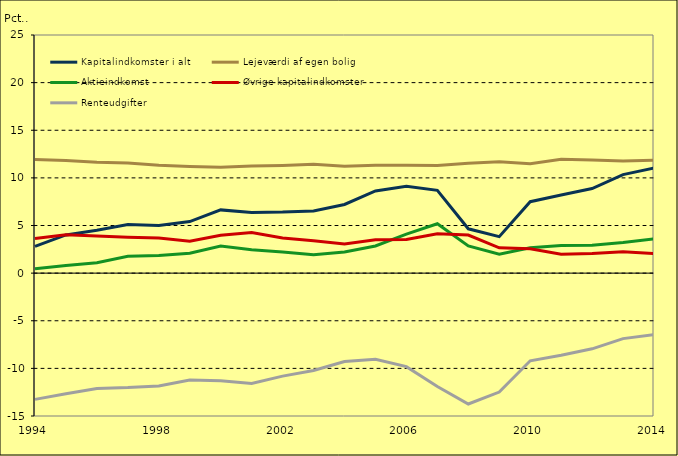
| Category | Kapitalindkomster i alt | Lejeværdi af egen bolig | Aktieindkomst | Øvrige kapitalindkomster | Renteudgifter |
|---|---|---|---|---|---|
| 1994.0 | 2.802 | 11.941 | 0.47 | 3.644 | -13.254 |
| 1995.0 | 4.007 | 11.833 | 0.81 | 4.025 | -12.662 |
| 1996.0 | 4.51 | 11.635 | 1.098 | 3.888 | -12.11 |
| 1997.0 | 5.095 | 11.568 | 1.769 | 3.77 | -12.011 |
| 1998.0 | 5.012 | 11.332 | 1.842 | 3.676 | -11.838 |
| 1999.0 | 5.416 | 11.19 | 2.096 | 3.354 | -11.223 |
| 2000.0 | 6.639 | 11.116 | 2.847 | 3.984 | -11.308 |
| 2001.0 | 6.368 | 11.234 | 2.464 | 4.257 | -11.587 |
| 2002.0 | 6.405 | 11.309 | 2.214 | 3.698 | -10.815 |
| 2003.0 | 6.524 | 11.433 | 1.928 | 3.388 | -10.225 |
| 2004.0 | 7.208 | 11.216 | 2.208 | 3.065 | -9.281 |
| 2005.0 | 8.626 | 11.318 | 2.848 | 3.505 | -9.044 |
| 2006.0 | 9.117 | 11.313 | 4.092 | 3.531 | -9.818 |
| 2007.0 | 8.696 | 11.287 | 5.187 | 4.131 | -11.908 |
| 2008.0 | 4.654 | 11.535 | 2.861 | 4 | -13.743 |
| 2009.0 | 3.829 | 11.682 | 1.978 | 2.658 | -12.488 |
| 2010.0 | 7.499 | 11.477 | 2.667 | 2.558 | -9.204 |
| 2011.0 | 8.203 | 11.949 | 2.896 | 1.987 | -8.629 |
| 2012.0 | 8.882 | 11.865 | 2.916 | 2.05 | -7.948 |
| 2013.0 | 10.343 | 11.767 | 3.208 | 2.243 | -6.875 |
| 2014.0 | 11.04 | 11.858 | 3.594 | 2.056 | -6.467 |